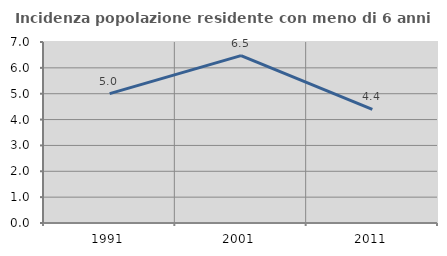
| Category | Incidenza popolazione residente con meno di 6 anni |
|---|---|
| 1991.0 | 5.003 |
| 2001.0 | 6.474 |
| 2011.0 | 4.396 |